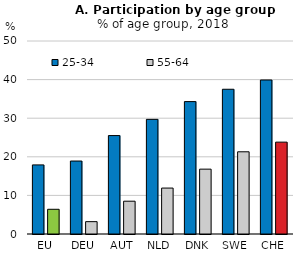
| Category | 25-34 | 55-64 |
|---|---|---|
| EU | 17.9 | 6.4 |
| DEU | 18.9 | 3.2 |
| AUT | 25.5 | 8.5 |
| NLD | 29.7 | 11.9 |
| DNK | 34.3 | 16.8 |
| SWE | 37.5 | 21.3 |
| CHE | 39.9 | 23.8 |